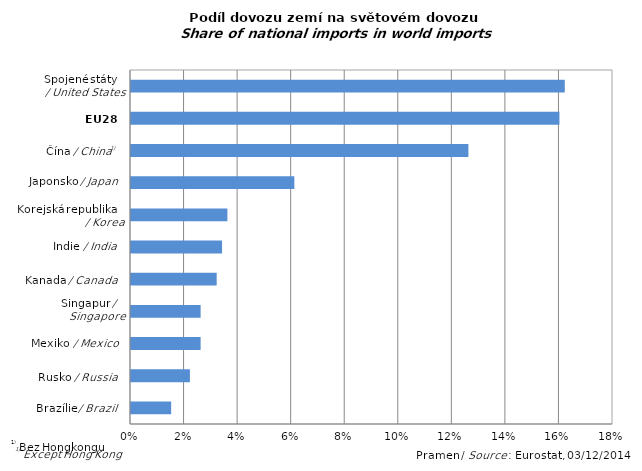
| Category | Series 0 |
|---|---|
|  | 0.015 |
|  | 0.022 |
|  | 0.026 |
|  | 0.026 |
|  | 0.032 |
|  | 0.034 |
|  | 0.036 |
|  | 0.061 |
|  | 0.126 |
|  | 0.16 |
|  | 0.162 |